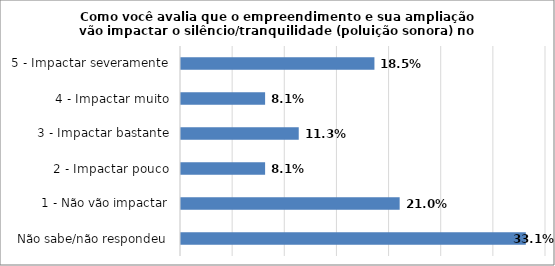
| Category | Series 0 |
|---|---|
| Não sabe/não respondeu | 0.331 |
| 1 - Não vão impactar | 0.21 |
| 2 - Impactar pouco | 0.081 |
| 3 - Impactar bastante | 0.113 |
| 4 - Impactar muito | 0.081 |
| 5 - Impactar severamente | 0.185 |